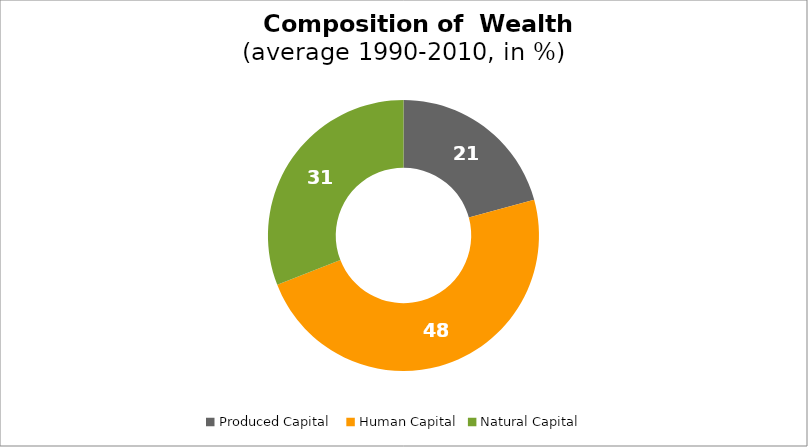
| Category | Series 0 |
|---|---|
| Produced Capital  | 20.74 |
| Human Capital | 48.345 |
| Natural Capital | 30.914 |